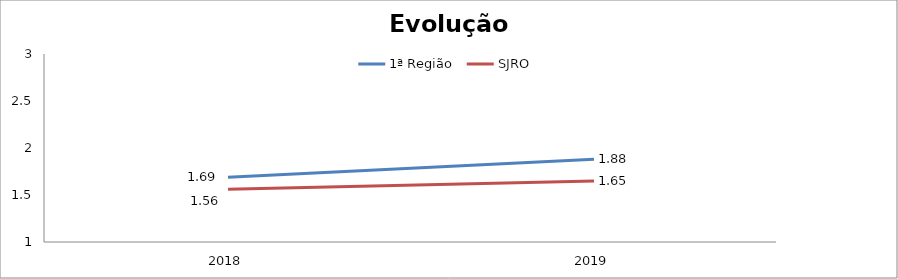
| Category | 1ª Região | SJRO |
|---|---|---|
| 2018.0 | 1.69 | 1.56 |
| 2019.0 | 1.88 | 1.65 |